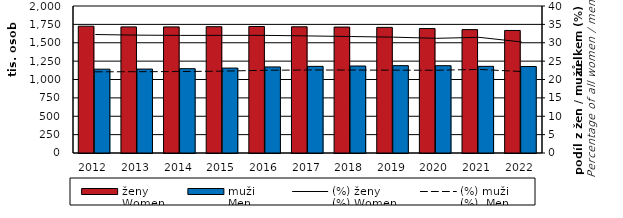
| Category | ženy  
Women | muži  
Men |
|---|---|---|
| 2012.0 | 1725329 | 1140727 |
| 2013.0 | 1715906 | 1141950 |
| 2014.0 | 1715731 | 1147479 |
| 2015.0 | 1718422 | 1155531 |
| 2016.0 | 1721438 | 1171031 |
| 2017.0 | 1717160 | 1178803 |
| 2018.0 | 1713384 | 1183589 |
| 2019.0 | 1708994 | 1188533 |
| 2020.0 | 1693444 | 1187980 |
| 2021.0 | 1678752 | 1178892 |
| 2022.0 | 1667251 | 1176929 |